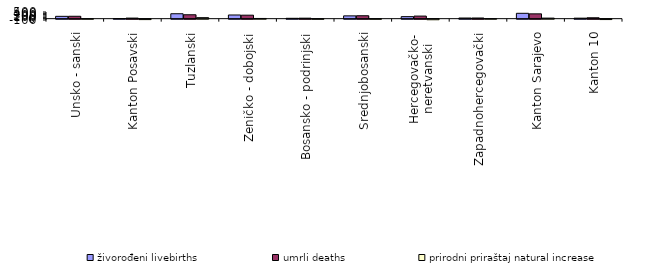
| Category | živorođeni livebirths | umrli deaths | prirodni priraštaj natural increase |
|---|---|---|---|
| Unsko - sanski | 175 | 179 | -4 |
| Kanton Posavski | 10 | 42 | -32 |
| Tuzlanski | 369 | 293 | 76 |
| Zeničko - dobojski | 276 | 261 | 15 |
| Bosansko - podrinjski | 27 | 37 | -10 |
| Srednjobosanski | 210 | 219 | -9 |
| Hercegovačko-
neretvanski | 151 | 193 | -42 |
| Zapadnohercegovački | 48 | 49 | -1 |
| Kanton Sarajevo | 402 | 361 | 41 |
| Kanton 10 | 38 | 67 | -29 |